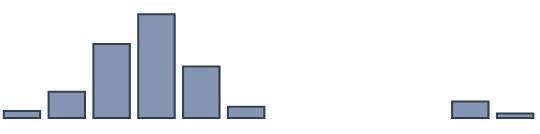
| Category | Series 0 |
|---|---|
| 0 | 2.4 |
| 1 | 8.9 |
| 2 | 25.1 |
| 3 | 35.2 |
| 4 | 17.5 |
| 5 | 3.8 |
| 6 | 0 |
| 7 | 0 |
| 8 | 0 |
| 9 | 0 |
| 10 | 5.6 |
| 11 | 1.5 |